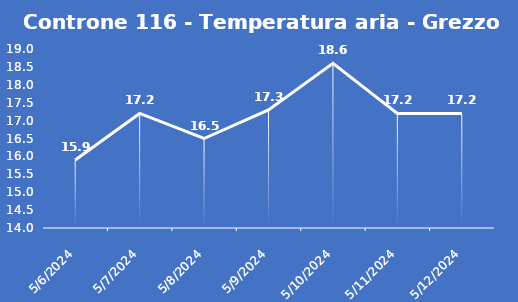
| Category | Controne 116 - Temperatura aria - Grezzo (°C) |
|---|---|
| 5/6/24 | 15.9 |
| 5/7/24 | 17.2 |
| 5/8/24 | 16.5 |
| 5/9/24 | 17.3 |
| 5/10/24 | 18.6 |
| 5/11/24 | 17.2 |
| 5/12/24 | 17.2 |